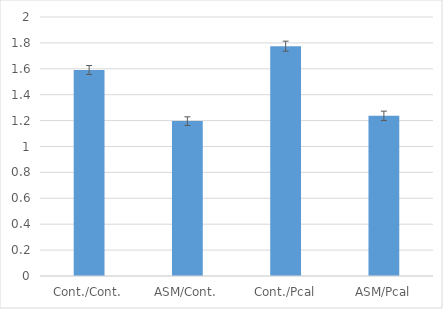
| Category | Series 0 |
|---|---|
| Cont./Cont. | 1.59 |
| ASM/Cont. | 1.196 |
| Cont./Pcal | 1.775 |
| ASM/Pcal | 1.237 |